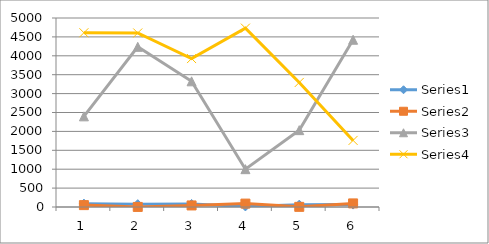
| Category | Series 0 | Series 1 | Series 2 | Series 3 |
|---|---|---|---|---|
| 0 | 89 | 50 | 2398 | 4610 |
| 1 | 74 | 2 | 4237 | 4604 |
| 2 | 81 | 41 | 3325 | 3927 |
| 3 | 15 | 90 | 1001 | 4732 |
| 4 | 62 | 4 | 2033 | 3295 |
| 5 | 64 | 95 | 4425 | 1762 |